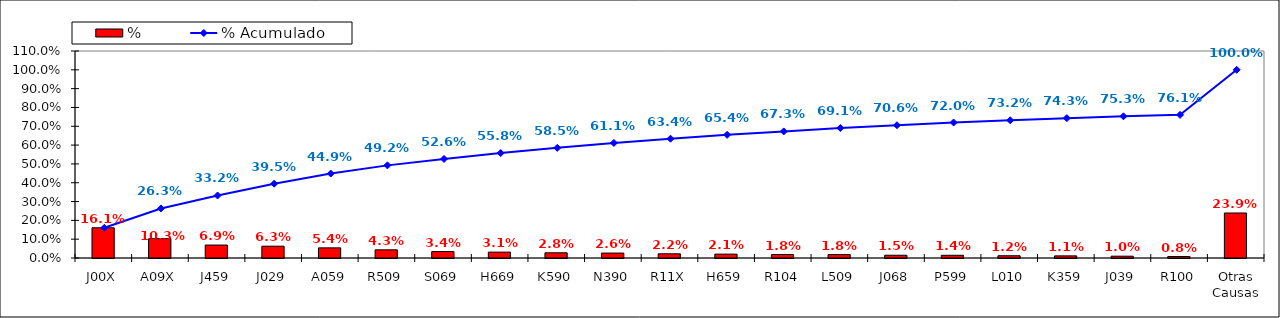
| Category | % |
|---|---|
| J00X | 0.161 |
| A09X | 0.103 |
| J459 | 0.069 |
| J029 | 0.063 |
| A059 | 0.054 |
| R509 | 0.043 |
| S069 | 0.034 |
| H669 | 0.031 |
| K590 | 0.028 |
| N390 | 0.026 |
| R11X | 0.022 |
| H659 | 0.021 |
| R104 | 0.018 |
| L509 | 0.018 |
| J068 | 0.015 |
| P599 | 0.014 |
| L010 | 0.012 |
| K359 | 0.011 |
| J039 | 0.01 |
| R100 | 0.008 |
| Otras Causas | 0.239 |